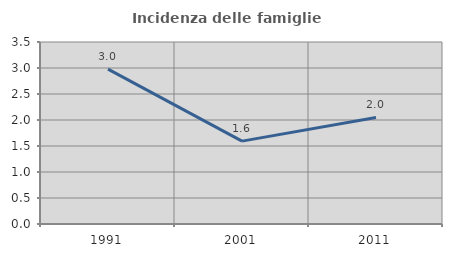
| Category | Incidenza delle famiglie numerose |
|---|---|
| 1991.0 | 2.979 |
| 2001.0 | 1.594 |
| 2011.0 | 2.049 |